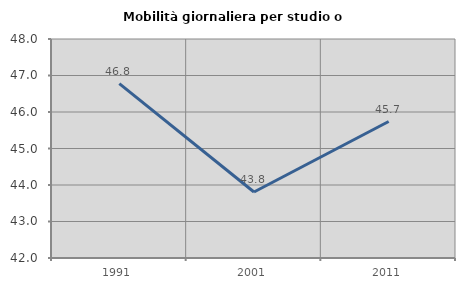
| Category | Mobilità giornaliera per studio o lavoro |
|---|---|
| 1991.0 | 46.775 |
| 2001.0 | 43.808 |
| 2011.0 | 45.739 |